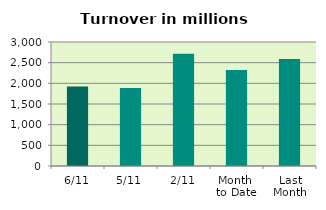
| Category | Series 0 |
|---|---|
| 6/11 | 1924.648 |
| 5/11 | 1885.111 |
| 2/11 | 2718.746 |
| Month 
to Date | 2324.743 |
| Last
Month | 2586.958 |